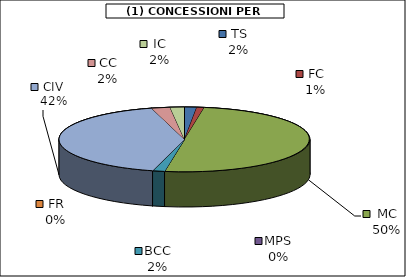
| Category | Series 0 |
|---|---|
| TS | 2020 |
| FC | 1229.125 |
| MC | 64184 |
| MPS | 0 |
| BCC | 1995 |
| FR | 0 |
| CIV | 53474.5 |
| CC | 3075 |
| IC | 2367 |